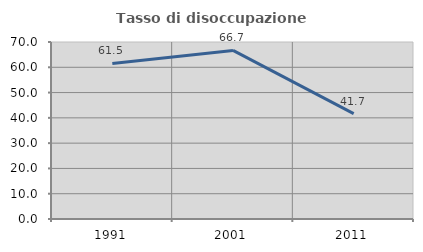
| Category | Tasso di disoccupazione giovanile  |
|---|---|
| 1991.0 | 61.538 |
| 2001.0 | 66.667 |
| 2011.0 | 41.667 |